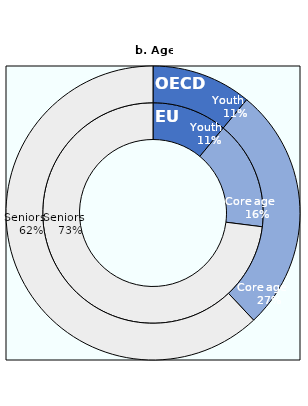
| Category | EU | OECD |
|---|---|---|
| Younth (18-30 years old) | 0.11 | 0.11 |
| Core age (31-49 years old) | 0.16 | 0.27 |
| Seniors (50-64 years old) | 0.73 | 0.62 |